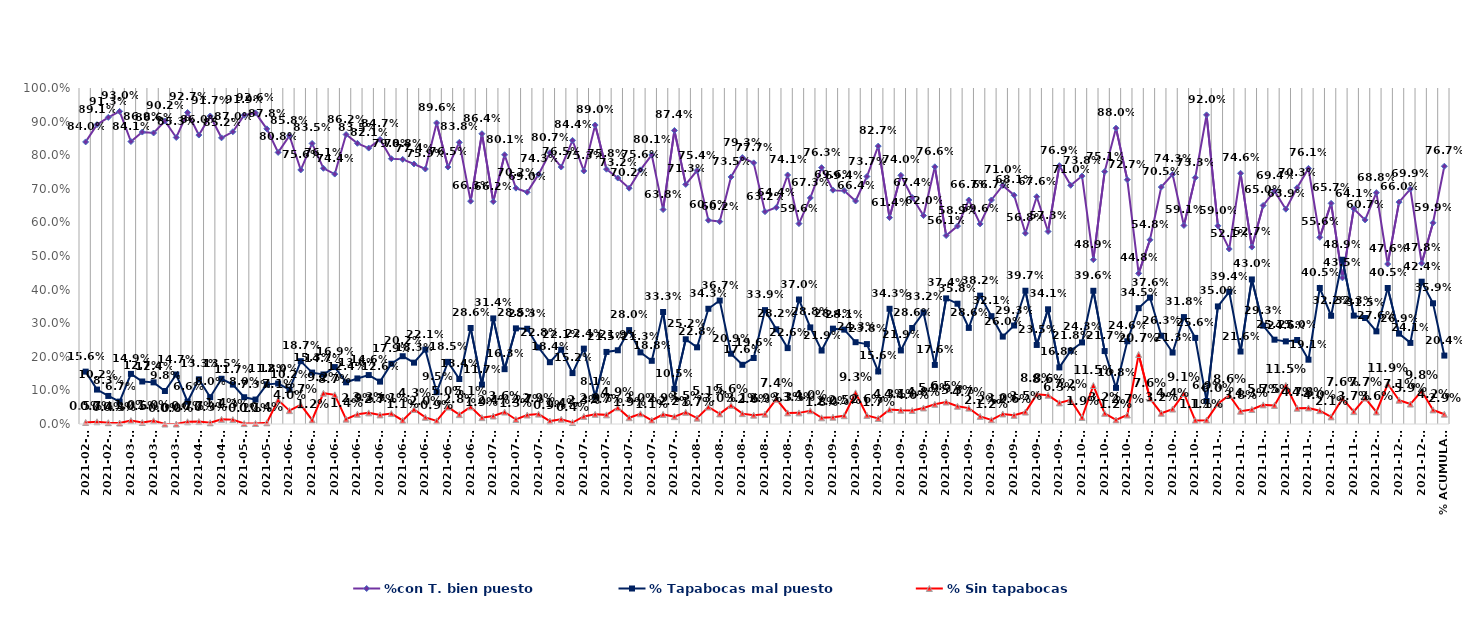
| Category | %con T. bien puesto | % Tapabocas mal puesto | % Sin tapabocas |
|---|---|---|---|
| 2021-02-19 | 0.84 | 0.156 | 0.005 |
| 2021-02-23 | 0.891 | 0.102 | 0.007 |
| 2021-02-25 | 0.913 | 0.083 | 0.004 |
| 2021-03-04 | 0.93 | 0.067 | 0.003 |
| 2021-03-05 | 0.841 | 0.149 | 0.01 |
| 2021-03-10 | 0.869 | 0.127 | 0.005 |
| 2021-03-11 | 0.866 | 0.124 | 0.01 |
| 2021-03-12 | 0.902 | 0.098 | 0 |
| 2021-03-29 | 0.853 | 0.147 | 0 |
| 2021-03-30 | 0.927 | 0.066 | 0.007 |
| 2021-04-06 | 0.86 | 0.133 | 0.007 |
| 2021-04-07 | 0.917 | 0.08 | 0.003 |
| 2021-04-15 | 0.852 | 0.135 | 0.014 |
| 2021-04-20 | 0.87 | 0.117 | 0.013 |
| 2021-05-04 | 0.919 | 0.08 | 0.001 |
| 2021-05-07 | 0.926 | 0.073 | 0.001 |
| 2021-05-21 | 0.878 | 0.118 | 0.004 |
| 2021-06-01 | 0.808 | 0.12 | 0.071 |
| 2021-06-03 | 0.858 | 0.102 | 0.04 |
| 2021-06-08 | 0.756 | 0.187 | 0.057 |
| 2021-06-10 | 0.835 | 0.153 | 0.012 |
| 2021-06-11 | 0.761 | 0.147 | 0.092 |
| 2021-06-12 | 0.744 | 0.169 | 0.087 |
| 2021-06-15 | 0.862 | 0.124 | 0.014 |
| 2021-06-16 | 0.835 | 0.136 | 0.029 |
| 2021-06-17 | 0.821 | 0.146 | 0.033 |
| 2021-06-19 | 0.847 | 0.126 | 0.027 |
| 2021-06-21 | 0.79 | 0.179 | 0.031 |
| 2021-06-22 | 0.788 | 0.202 | 0.011 |
| 2021-06-23 | 0.774 | 0.183 | 0.043 |
| 2021-06-24 | 0.759 | 0.221 | 0.02 |
| 2021-06-25 | 0.896 | 0.095 | 0.009 |
| 2021-06-26 | 0.765 | 0.185 | 0.05 |
| 2021-06-29 | 0.838 | 0.134 | 0.028 |
| 2021-06-30 | 0.663 | 0.286 | 0.051 |
| 2021-07-01 | 0.864 | 0.117 | 0.019 |
| 2021-07-03 | 0.662 | 0.314 | 0.024 |
| 2021-07-06 | 0.801 | 0.163 | 0.036 |
| 2021-07-07 | 0.702 | 0.285 | 0.013 |
| 2021-07-08 | 0.69 | 0.283 | 0.027 |
| 2021-07-10 | 0.743 | 0.228 | 0.029 |
| 2021-07-12 | 0.807 | 0.184 | 0.009 |
| 2021-07-13 | 0.765 | 0.221 | 0.014 |
| 2021-07-14 | 0.844 | 0.152 | 0.004 |
| 2021-07-15 | 0.753 | 0.224 | 0.023 |
| 2021-07-16 | 0.89 | 0.081 | 0.029 |
| 2021-07-19 | 0.758 | 0.215 | 0.027 |
| 2021-07-21 | 0.732 | 0.219 | 0.049 |
| 2021-07-22 | 0.702 | 0.28 | 0.019 |
| 2021-07-23 | 0.756 | 0.213 | 0.03 |
| 2021-07-24 | 0.801 | 0.188 | 0.011 |
| 2021-07-28 | 0.638 | 0.333 | 0.029 |
| 2021-07-29 | 0.874 | 0.105 | 0.022 |
| 2021-07-31 | 0.713 | 0.252 | 0.035 |
| 2021-08-03 | 0.754 | 0.228 | 0.017 |
| 2021-08-04 | 0.606 | 0.343 | 0.051 |
| 2021-08-05 | 0.602 | 0.367 | 0.03 |
| 2021-08-06 | 0.735 | 0.209 | 0.056 |
| 2021-08-12 | 0.793 | 0.176 | 0.031 |
| 2021-08-17 | 0.777 | 0.196 | 0.026 |
| 2021-08-18 | 0.632 | 0.339 | 0.029 |
| 2021-08-19 | 0.644 | 0.282 | 0.074 |
| 2021-08-20 | 0.741 | 0.226 | 0.033 |
| 2021-08-30 | 0.596 | 0.37 | 0.033 |
| 2021-09-01 | 0.673 | 0.288 | 0.04 |
| 2021-09-02 | 0.763 | 0.219 | 0.018 |
| 2021-09-03 | 0.696 | 0.284 | 0.02 |
| 2021-09-04 | 0.694 | 0.281 | 0.025 |
| 2021-09-06 | 0.664 | 0.243 | 0.093 |
| 2021-09-08 | 0.737 | 0.238 | 0.026 |
| 2021-09-10 | 0.827 | 0.156 | 0.017 |
| 2021-09-13 | 0.614 | 0.343 | 0.043 |
| 2021-09-14 | 0.74 | 0.219 | 0.041 |
| 2021-09-15 | 0.674 | 0.286 | 0.04 |
| 2021-09-16 | 0.62 | 0.332 | 0.048 |
| 2021-09-17 | 0.766 | 0.176 | 0.059 |
| 2021-09-18 | 0.561 | 0.374 | 0.065 |
| 2021-09-20 | 0.589 | 0.358 | 0.053 |
| 2021-09-21 | 0.667 | 0.286 | 0.047 |
| 2021-09-22 | 0.596 | 0.382 | 0.022 |
| 2021-09-23 | 0.667 | 0.321 | 0.012 |
| 2021-09-24 | 0.71 | 0.26 | 0.03 |
| 2021-09-25 | 0.681 | 0.293 | 0.026 |
| 2021-09-27 | 0.568 | 0.397 | 0.035 |
| 2021-09-28 | 0.676 | 0.235 | 0.088 |
| 2021-09-29 | 0.573 | 0.341 | 0.086 |
| 2021-09-30 | 0.769 | 0.168 | 0.063 |
| 2021-10-01 | 0.71 | 0.218 | 0.072 |
| 2021-10-06 | 0.738 | 0.243 | 0.019 |
| 2021-10-11 | 0.489 | 0.396 | 0.115 |
| 2021-10-12 | 0.751 | 0.217 | 0.032 |
| 2021-10-13 | 0.88 | 0.108 | 0.012 |
| 2021-10-14 | 0.727 | 0.246 | 0.027 |
| 2021-10-15 | 0.448 | 0.345 | 0.207 |
| 2021-10-16 | 0.548 | 0.376 | 0.076 |
| 2021-10-19 | 0.705 | 0.263 | 0.032 |
| 2021-10-20 | 0.743 | 0.213 | 0.044 |
| 2021-10-26 | 0.591 | 0.318 | 0.091 |
| 2021-10-27 | 0.733 | 0.256 | 0.011 |
| 2021-10-28 | 0.92 | 0.069 | 0.011 |
| 2021-11-02 | 0.59 | 0.35 | 0.06 |
| 2021-11-03 | 0.521 | 0.394 | 0.086 |
| 2021-11-06 | 0.746 | 0.216 | 0.038 |
| 2021-11-09 | 0.527 | 0.43 | 0.043 |
| 2021-11-10 | 0.65 | 0.293 | 0.057 |
| 2021-11-12 | 0.694 | 0.251 | 0.055 |
| 2021-11-17 | 0.639 | 0.246 | 0.115 |
| 2021-11-18 | 0.703 | 0.25 | 0.047 |
| 2021-11-19 | 0.761 | 0.191 | 0.048 |
| 2021-11-23 | 0.556 | 0.405 | 0.04 |
| 2021-11-25 | 0.657 | 0.322 | 0.021 |
| 2021-11-26 | 0.435 | 0.489 | 0.076 |
| 2021-11-29 | 0.641 | 0.323 | 0.037 |
| 2021-12-03 | 0.607 | 0.315 | 0.077 |
| 2021-12-04 | 0.688 | 0.276 | 0.036 |
| 2021-12-07 | 0.476 | 0.405 | 0.119 |
| 2021-12-09 | 0.66 | 0.269 | 0.071 |
| 2021-12-11 | 0.699 | 0.241 | 0.059 |
| 2021-12-13 | 0.478 | 0.424 | 0.098 |
| 2021-12-14 | 0.599 | 0.359 | 0.042 |
| % Acumulado | 0.767 | 0.204 | 0.029 |